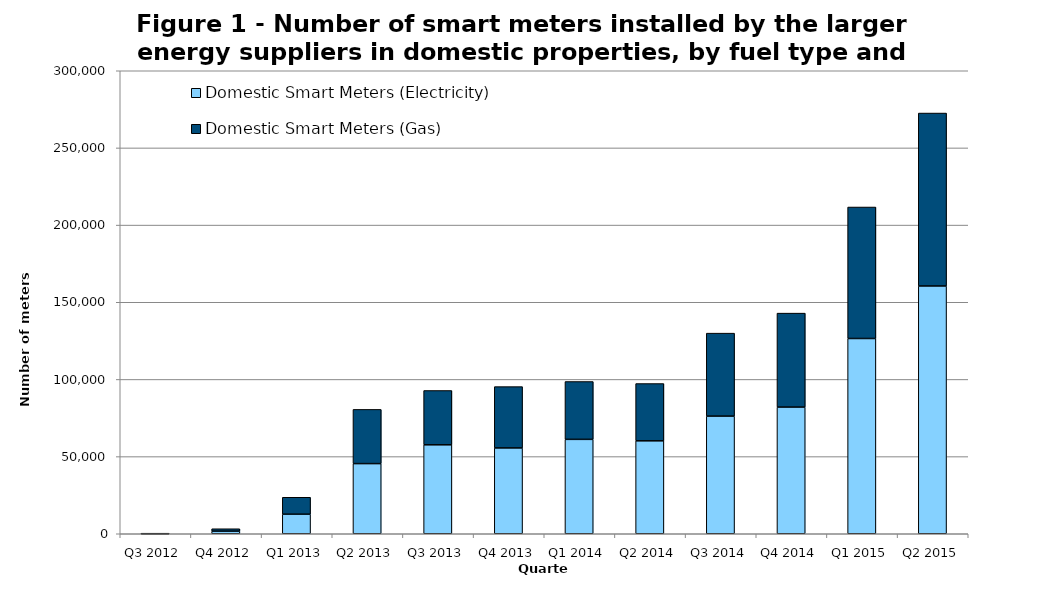
| Category | Domestic Smart Meters (Electricity) | Domestic Smart Meters (Gas) |
|---|---|---|
| Q3 2012 | 36 | 32 |
| Q4 2012 | 1671 | 1570 |
| Q1 2013 | 12678 | 10963 |
| Q2 2013 | 45456 | 35130 |
| Q3 2013 | 57632 | 35190 |
| Q4 2013 | 55603 | 39730 |
| Q1 2014 | 61164 | 37480 |
| Q2 2014 | 60216 | 37113 |
| Q3 2014 | 76227 | 53764 |
| Q4 2014 | 82081 | 60882 |
| Q1 2015 | 126515 | 85202 |
| Q2 2015 | 160543 | 112055 |